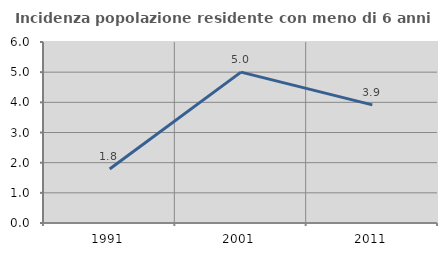
| Category | Incidenza popolazione residente con meno di 6 anni |
|---|---|
| 1991.0 | 1.792 |
| 2001.0 | 5 |
| 2011.0 | 3.916 |